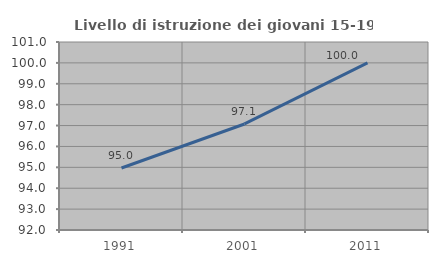
| Category | Livello di istruzione dei giovani 15-19 anni |
|---|---|
| 1991.0 | 94.969 |
| 2001.0 | 97.076 |
| 2011.0 | 100 |